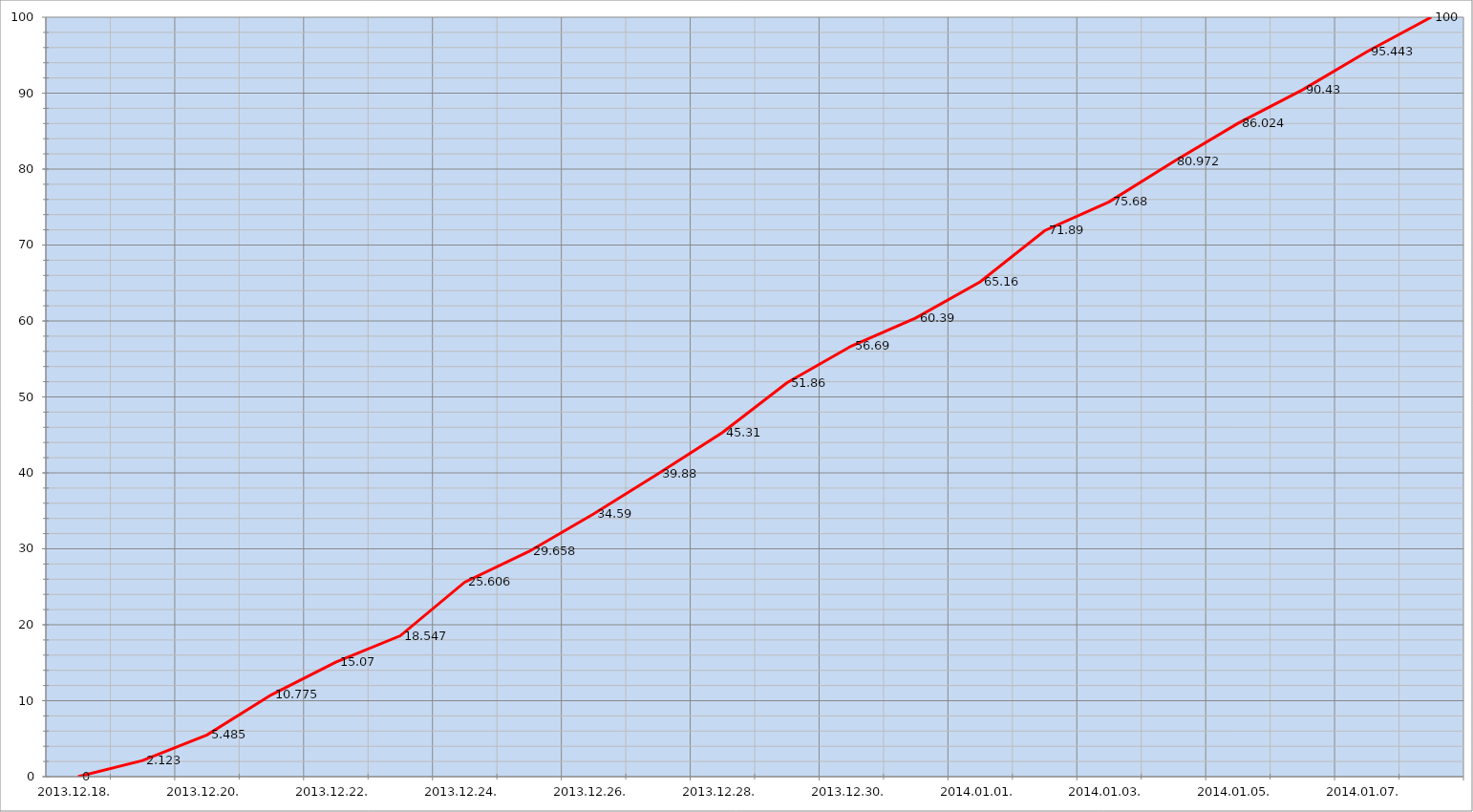
| Category | Szerver 3 |
|---|---|
| 2013-12-18 | 0 |
| 2013-12-19 | 2.123 |
| 2013-12-20 | 5.485 |
| 2013-12-21 | 10.775 |
| 2013-12-22 | 15.07 |
| 2013-12-23 | 18.547 |
| 2013-12-24 | 25.606 |
| 2013-12-25 | 29.658 |
| 2013-12-26 | 34.59 |
| 2013-12-27 | 39.88 |
| 2013-12-28 | 45.31 |
| 2013-12-29 | 51.86 |
| 2013-12-30 | 56.69 |
| 2013-12-31 | 60.39 |
| 2014-01-01 | 65.16 |
| 2014-01-02 | 71.89 |
| 2014-01-03 | 75.68 |
| 2014-01-04 | 80.972 |
| 2014-01-05 | 86.024 |
| 2014-01-06 | 90.43 |
| 2014-01-07 | 95.443 |
| 2014-01-08 | 100 |